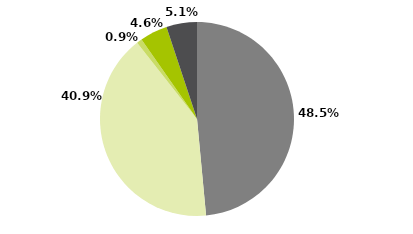
| Category | Series 0 |
|---|---|
| Multimercados Macro | 0.485 |
| Multimercados Livre | 0.409 |
| Multimercados L/S - Neutro | 0.009 |
| Multimercados L/S - Direcional | 0.046 |
| Outros | 0.051 |